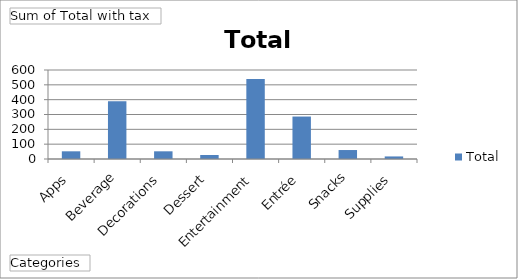
| Category | Total |
|---|---|
| Apps | 51.84 |
| Beverage | 388.8 |
| Decorations | 51.84 |
| Dessert | 27 |
| Entertainment | 540 |
| Entrée | 286.2 |
| Snacks | 60.48 |
| Supplies | 17.28 |